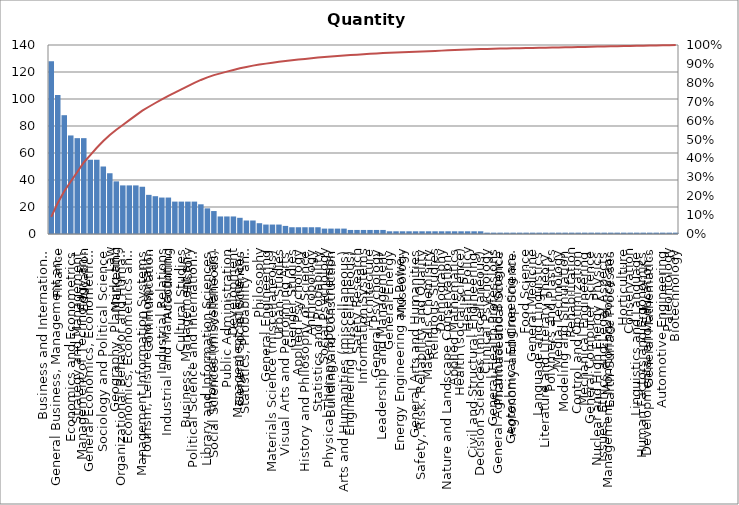
| Category | Quantity |
|---|---|
| Business and International Management | 128 |
| Finance | 103 |
| General Business, Management and Accounting | 88 |
| Economics and Econometrics | 73 |
| Strategy and Management | 71 |
| Education | 71 |
| Management of Technology and Innovation | 55 |
| General Economics, Econometrics and Finance | 55 |
| Sociology and Political Science | 50 |
| Law | 45 |
| Marketing | 39 |
| Geography, Planning and Development | 36 |
| Organizational Behavior and Human Resource Management | 36 |
| Economics, Econometrics and Finance (miscellaneous) | 36 |
| Management Information Systems | 35 |
| Communication | 29 |
| Tourism, Leisure and Hospitality Management | 28 |
| Industrial Relations | 27 |
| Accounting | 27 |
| Industrial and Manufacturing Engineering | 24 |
| Cultural Studies | 24 |
| History | 24 |
| Business, Management and Accounting (miscellaneous) | 24 |
| Political Science and International Relations | 22 |
| Library and Information Sciences | 19 |
| Social Sciences (miscellaneous) | 17 |
| Information Systems and Management | 13 |
| Public Administration | 13 |
| Development | 13 |
| General Social Sciences | 12 |
| Management Science and Operations Research | 10 |
| Statistics, Probability and Uncertainty | 10 |
| Philosophy | 8 |
| General Engineering | 7 |
| Materials Science (miscellaneous) | 7 |
| Urban Studies | 7 |
| Visual Arts and Performing Arts | 6 |
| Gender Studies | 5 |
| Applied Psychology | 5 |
| History and Philosophy of Science | 5 |
| Anthropology | 5 |
| Statistics and Probability | 5 |
| Social Psychology | 4 |
| Building and Construction | 4 |
| Physical Therapy, Sports Therapy and Rehabilitation | 4 |
| Arts and Humanities (miscellaneous) | 4 |
| Engineering (miscellaneous) | 3 |
| Safety Research | 3 |
| Information Systems | 3 |
| Architecture | 3 |
| General Psychology | 3 |
| Leadership and Management | 3 |
| General Energy | 2 |
|  | 2 |
| Museology | 2 |
| Energy Engineering and Power Technology | 2 |
| General Arts and Humanities | 2 |
| Safety, Risk, Reliability and Quality | 2 |
| Materials Chemistry | 2 |
| Religious Studies | 2 |
| Demography | 2 |
| Nature and Landscape Conservation | 2 |
| Applied Mathematics | 2 |
| Health (social science) | 2 |
| Health Policy | 2 |
| Civil and Structural Engineering | 2 |
| Decision Sciences (miscellaneous) | 2 |
| Clinical Psychology | 1 |
| General Health Professions | 1 |
| Pharmaceutical Science | 1 |
| General Agricultural and Biological Sciences | 1 |
| Agronomy and Crop Science | 1 |
| Geotechnical Engineering and Engineering Geology | 1 |
| Food Science | 1 |
| General Medicine | 1 |
| Language and Linguistics | 1 |
| Literature and Literary Theory | 1 |
| Polymers and Plastics | 1 |
| Media Technology | 1 |
| Modeling and Simulation | 1 |
| Rehabilitation | 1 |
| Control and Optimization | 1 |
| Mechanical Engineering | 1 |
| General Computer Science | 1 |
| Nuclear and High Energy Physics | 1 |
| Issues, Ethics and Legal Aspects | 1 |
| Earth-Surface Processes | 1 |
| Management, Monitoring, Policy and Law | 1 |
| Horticulture | 1 |
| Conservation | 1 |
| Linguistics and Language | 1 |
| Human Factors and Ergonomics | 1 |
| General Mathematics | 1 |
| Developmental and Educational Psychology | 1 |
| Automotive Engineering | 1 |
| Paleontology | 1 |
| Biotechnology | 1 |